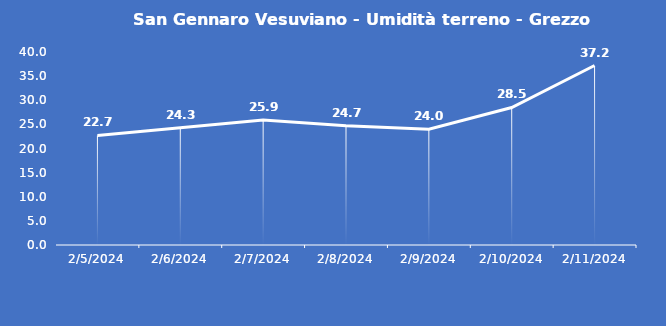
| Category | San Gennaro Vesuviano - Umidità terreno - Grezzo (%VWC) |
|---|---|
| 2/5/24 | 22.7 |
| 2/6/24 | 24.3 |
| 2/7/24 | 25.9 |
| 2/8/24 | 24.7 |
| 2/9/24 | 24 |
| 2/10/24 | 28.5 |
| 2/11/24 | 37.2 |